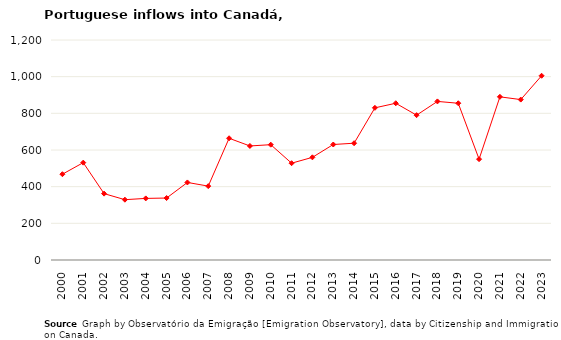
| Category | Entradas |
|---|---|
| 2000.0 | 468 |
| 2001.0 | 531 |
| 2002.0 | 362 |
| 2003.0 | 329 |
| 2004.0 | 336 |
| 2005.0 | 338 |
| 2006.0 | 423 |
| 2007.0 | 403 |
| 2008.0 | 664 |
| 2009.0 | 622 |
| 2010.0 | 629 |
| 2011.0 | 528 |
| 2012.0 | 560 |
| 2013.0 | 630 |
| 2014.0 | 637 |
| 2015.0 | 830 |
| 2016.0 | 855 |
| 2017.0 | 790 |
| 2018.0 | 865 |
| 2019.0 | 855 |
| 2020.0 | 550 |
| 2021.0 | 890 |
| 2022.0 | 875 |
| 2023.0 | 1005 |